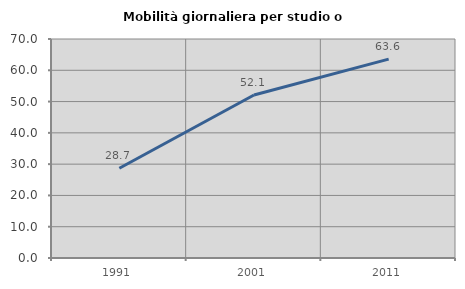
| Category | Mobilità giornaliera per studio o lavoro |
|---|---|
| 1991.0 | 28.696 |
| 2001.0 | 52.101 |
| 2011.0 | 63.571 |